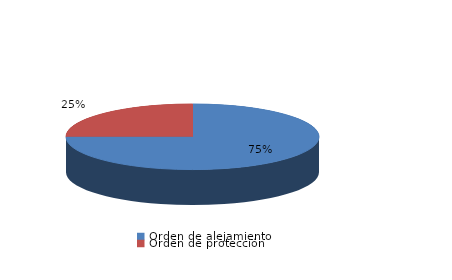
| Category | Series 0 |
|---|---|
| Orden de alejamiento | 6 |
| Orden de protección | 2 |